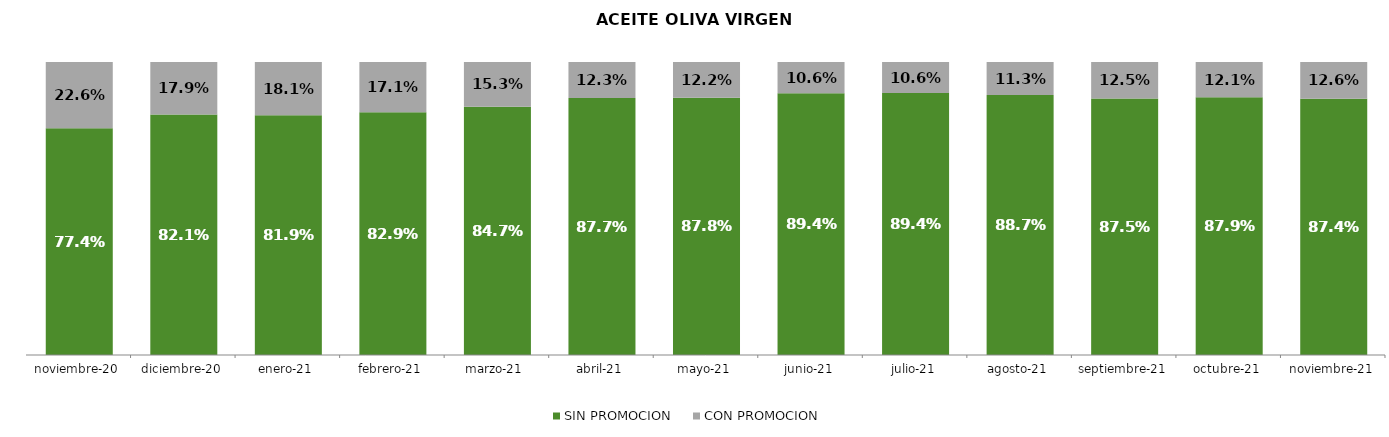
| Category | SIN PROMOCION   | CON PROMOCION   |
|---|---|---|
| 2020-11-01 | 0.774 | 0.226 |
| 2020-12-01 | 0.821 | 0.179 |
| 2021-01-01 | 0.819 | 0.181 |
| 2021-02-01 | 0.829 | 0.171 |
| 2021-03-01 | 0.847 | 0.153 |
| 2021-04-01 | 0.877 | 0.123 |
| 2021-05-01 | 0.878 | 0.122 |
| 2021-06-01 | 0.894 | 0.106 |
| 2021-07-01 | 0.894 | 0.106 |
| 2021-08-01 | 0.887 | 0.113 |
| 2021-09-01 | 0.875 | 0.125 |
| 2021-10-01 | 0.879 | 0.121 |
| 2021-11-01 | 0.874 | 0.126 |